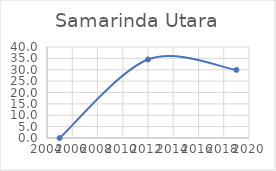
| Category | Series 0 |
|---|---|
| 2005.0 | 0 |
| 2012.0 | 34.501 |
| 2019.0 | 29.924 |